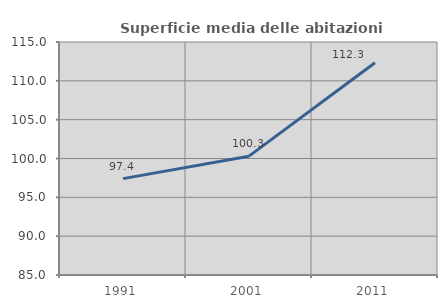
| Category | Superficie media delle abitazioni occupate |
|---|---|
| 1991.0 | 97.411 |
| 2001.0 | 100.301 |
| 2011.0 | 112.325 |